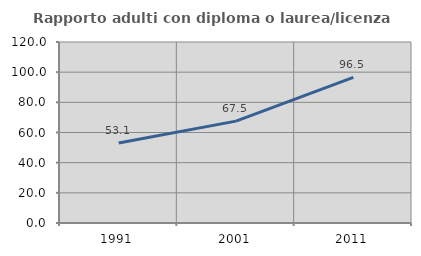
| Category | Rapporto adulti con diploma o laurea/licenza media  |
|---|---|
| 1991.0 | 53.061 |
| 2001.0 | 67.532 |
| 2011.0 | 96.516 |